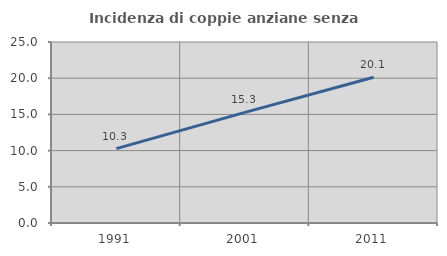
| Category | Incidenza di coppie anziane senza figli  |
|---|---|
| 1991.0 | 10.274 |
| 2001.0 | 15.287 |
| 2011.0 | 20.122 |